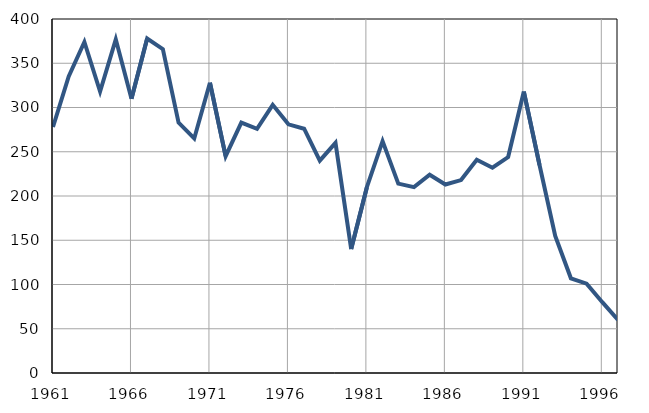
| Category | Infants
deaths |
|---|---|
| 1961.0 | 278 |
| 1962.0 | 335 |
| 1963.0 | 374 |
| 1964.0 | 318 |
| 1965.0 | 377 |
| 1966.0 | 310 |
| 1967.0 | 378 |
| 1968.0 | 366 |
| 1969.0 | 283 |
| 1970.0 | 265 |
| 1971.0 | 328 |
| 1972.0 | 245 |
| 1973.0 | 283 |
| 1974.0 | 276 |
| 1975.0 | 303 |
| 1976.0 | 281 |
| 1977.0 | 276 |
| 1978.0 | 240 |
| 1979.0 | 260 |
| 1980.0 | 140 |
| 1981.0 | 210 |
| 1982.0 | 262 |
| 1983.0 | 214 |
| 1984.0 | 210 |
| 1985.0 | 224 |
| 1986.0 | 213 |
| 1987.0 | 218 |
| 1988.0 | 241 |
| 1989.0 | 232 |
| 1990.0 | 244 |
| 1991.0 | 318 |
| 1992.0 | 235 |
| 1993.0 | 155 |
| 1994.0 | 107 |
| 1995.0 | 101 |
| 1996.0 | 80 |
| 1997.0 | 60 |